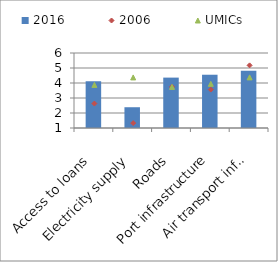
| Category | 2016 |
|---|---|
| Access to loans | 4.117 |
| Electricity supply | 2.385 |
| Roads | 4.36 |
| Port infrastructure | 4.552 |
| Air transport infr. | 4.809 |